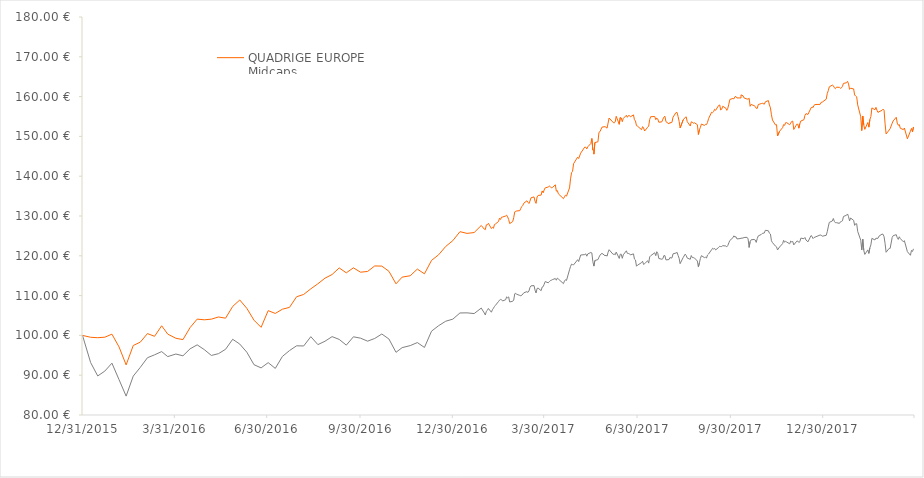
| Category |  QUADRIGE EUROPE
Midcaps    |  Stoxx Europe Ex UK Small Net Return  |
|---|---|---|
| 12/31/15 | 100 | 100 |
| 1/8/16 | 99.53 | 93.186 |
| 1/15/16 | 99.42 | 89.81 |
| 1/22/16 | 99.55 | 91.035 |
| 1/29/16 | 100.31 | 93.024 |
| 2/5/16 | 97.11 | 88.883 |
| 2/12/16 | 92.59 | 84.746 |
| 2/19/16 | 97.46 | 89.771 |
| 2/26/16 | 98.31 | 91.98 |
| 3/4/16 | 100.46 | 94.39 |
| 3/11/16 | 99.77 | 95.116 |
| 3/18/16 | 102.42 | 95.935 |
| 3/24/16 | 100.32 | 94.673 |
| 4/1/16 | 99.28 | 95.319 |
| 4/8/16 | 98.94 | 94.872 |
| 4/15/16 | 101.95 | 96.62 |
| 4/22/16 | 104.09 | 97.627 |
| 4/29/16 | 103.92 | 96.434 |
| 5/6/16 | 104.08 | 94.964 |
| 5/13/16 | 104.63 | 95.412 |
| 5/20/16 | 104.33 | 96.51 |
| 5/27/16 | 107.27 | 99.025 |
| 6/3/16 | 108.9 | 97.822 |
| 6/10/16 | 106.78 | 95.755 |
| 6/17/16 | 103.83 | 92.646 |
| 6/24/16 | 102.03 | 91.833 |
| 7/1/16 | 106.22 | 93.156 |
| 7/8/16 | 105.52 | 91.714 |
| 7/15/16 | 106.58 | 94.707 |
| 7/22/16 | 107.04 | 96.186 |
| 7/29/16 | 109.71 | 97.385 |
| 8/5/16 | 110.29 | 97.348 |
| 8/12/16 | 111.7 | 99.682 |
| 8/19/16 | 112.97 | 97.683 |
| 8/26/16 | 114.38 | 98.537 |
| 9/2/16 | 115.3 | 99.693 |
| 9/9/16 | 116.95 | 98.993 |
| 9/16/16 | 115.72 | 97.554 |
| 9/23/16 | 116.98 | 99.646 |
| 9/30/16 | 115.88 | 99.306 |
| 10/7/16 | 116.07 | 98.55 |
| 10/14/16 | 117.45 | 99.231 |
| 10/21/16 | 117.41 | 100.348 |
| 10/28/16 | 116.11 | 99.094 |
| 11/4/16 | 112.96 | 95.749 |
| 11/10/16 | 114.64 | 96.922 |
| 11/18/16 | 114.99 | 97.437 |
| 11/25/16 | 116.66 | 98.2 |
| 12/2/16 | 115.47 | 96.974 |
| 12/9/16 | 118.85 | 101.063 |
| 12/16/16 | 120.26 | 102.444 |
| 12/23/16 | 122.36 | 103.564 |
| 12/30/16 | 123.81 | 104.089 |
| 1/6/17 | 126.06 | 105.639 |
| 1/13/17 | 125.63 | 105.667 |
| 1/20/17 | 125.84 | 105.481 |
| 1/27/17 | 127.62 | 106.868 |
| 1/30/17 | 126.7 | 105.623 |
| 1/31/17 | 126.57 | 105.126 |
| 2/1/17 | 127.78 | 106.058 |
| 2/2/17 | 127.81 | 106.291 |
| 2/3/17 | 128.17 | 106.762 |
| 2/6/17 | 126.85 | 105.827 |
| 2/7/17 | 127.16 | 106.445 |
| 2/8/17 | 126.91 | 106.819 |
| 2/9/17 | 127.85 | 107.249 |
| 2/10/17 | 128 | 107.558 |
| 2/13/17 | 128.62 | 108.502 |
| 2/14/17 | 129.45 | 108.857 |
| 2/15/17 | 129.13 | 109.04 |
| 2/16/17 | 129.71 | 108.969 |
| 2/17/17 | 129.74 | 108.658 |
| 2/20/17 | 130 | 108.958 |
| 2/21/17 | 130.21 | 109.684 |
| 2/22/17 | 129.76 | 109.459 |
| 2/23/17 | 129.15 | 109.671 |
| 2/24/17 | 128.09 | 108.407 |
| 2/27/17 | 128.61 | 108.57 |
| 2/28/17 | 129.59 | 108.9 |
| 3/1/17 | 131.04 | 110.46 |
| 3/2/17 | 131.18 | 110.56 |
| 3/3/17 | 131.27 | 110.33 |
| 3/6/17 | 131.34 | 110.05 |
| 3/7/17 | 131.94 | 109.95 |
| 3/8/17 | 132.4 | 110.1 |
| 3/9/17 | 132.69 | 110.4 |
| 3/10/17 | 133.23 | 110.71 |
| 3/13/17 | 133.82 | 111 |
| 3/14/17 | 133.45 | 110.8 |
| 3/15/17 | 133.14 | 111.16 |
| 3/16/17 | 133.75 | 112.04 |
| 3/17/17 | 134.56 | 112.45 |
| 3/20/17 | 134.8 | 112.52 |
| 3/21/17 | 133.73 | 111.36 |
| 3/22/17 | 133.17 | 110.66 |
| 3/23/17 | 134.76 | 111.78 |
| 3/24/17 | 135.17 | 111.89 |
| 3/27/17 | 135.25 | 111.24 |
| 3/28/17 | 136.3 | 112.14 |
| 3/29/17 | 135.83 | 112.25 |
| 3/30/17 | 136.54 | 112.84 |
| 3/31/17 | 137.07 | 113.53 |
| 4/3/17 | 137.28 | 113.21 |
| 4/4/17 | 137.52 | 113.49 |
| 4/5/17 | 137.4 | 113.75 |
| 4/6/17 | 137.08 | 113.85 |
| 4/7/17 | 137.12 | 114 |
| 4/10/17 | 137.84 | 114.29 |
| 4/11/17 | 136.25 | 113.87 |
| 4/12/17 | 136.38 | 114.4 |
| 4/13/17 | 135.57 | 114.17 |
| 4/18/17 | 134.36 | 113.01 |
| 4/19/17 | 134.8 | 113.64 |
| 4/20/17 | 135.23 | 113.99 |
| 4/21/17 | 135 | 113.81 |
| 4/24/17 | 137.05 | 116.49 |
| 4/25/17 | 139.34 | 117.33 |
| 4/26/17 | 140.88 | 117.91 |
| 4/27/17 | 141.24 | 117.78 |
| 4/28/17 | 143.14 | 117.72 |
| 5/2/17 | 144.79 | 119.02 |
| 5/3/17 | 144.45 | 118.56 |
| 5/5/17 | 145.8 | 120.19 |
| 5/9/17 | 147.32 | 120.31 |
| 5/10/17 | 147.28 | 120.49 |
| 5/11/17 | 146.85 | 119.9 |
| 5/12/17 | 147.39 | 120.47 |
| 5/15/17 | 148.21 | 120.83 |
| 5/16/17 | 149.47 | 120.71 |
| 5/17/17 | 146.55 | 118.52 |
| 5/17/17 | 146.55 | 118.52 |
| 5/18/17 | 146.55 | 117.41 |
| 5/18/17 | 146.55 | 117.41 |
| 5/18/17 | 145.54 | 117.41 |
| 5/19/17 | 148.45 | 118.82 |
| 5/22/17 | 148.65 | 119.04 |
| 5/23/17 | 151 | 119.65 |
| 5/24/17 | 151.19 | 120.17 |
| 5/26/17 | 152.33 | 120.63 |
| 5/29/17 | 152.45 | 120.01 |
| 5/30/17 | 152.26 | 120.15 |
| 5/31/17 | 152.08 | 119.9 |
| 6/1/17 | 153.35 | 120.89 |
| 6/2/17 | 154.62 | 121.53 |
| 6/6/17 | 153.5 | 120.35 |
| 6/7/17 | 153.38 | 120.46 |
| 6/8/17 | 153.63 | 120.25 |
| 6/9/17 | 155.05 | 120.94 |
| 6/12/17 | 153.04 | 119.34 |
| 6/13/17 | 154.75 | 120.4 |
| 6/14/17 | 154.63 | 120.39 |
| 6/15/17 | 153.7 | 119.37 |
| 6/16/17 | 154.51 | 120.25 |
| 6/19/17 | 155.31 | 121.26 |
| 6/20/17 | 154.8 | 120.61 |
| 6/21/17 | 155.22 | 120.58 |
| 6/22/17 | 155.25 | 120.53 |
| 6/23/17 | 154.92 | 120.22 |
| 6/26/17 | 155.41 | 120.49 |
| 6/27/17 | 154.18 | 119.17 |
| 6/28/17 | 153.86 | 118.95 |
| 6/29/17 | 152.71 | 117.38 |
| 6/30/17 | 152.57 | 117.64 |
| 7/4/17 | 151.69 | 118.29 |
| 7/5/17 | 152.45 | 118.64 |
| 7/6/17 | 152.12 | 117.81 |
| 7/7/17 | 151.35 | 118 |
| 7/10/17 | 152.31 | 118.78 |
| 7/11/17 | 152.59 | 118.16 |
| 7/12/17 | 154.25 | 119.74 |
| 7/13/17 | 154.95 | 120.02 |
| 7/17/17 | 154.99 | 120.77 |
| 7/18/17 | 154.21 | 120.03 |
| 7/19/17 | 154.6 | 121.03 |
| 7/20/17 | 154.36 | 120.58 |
| 7/21/17 | 153.55 | 119.33 |
| 7/24/17 | 153.66 | 119.13 |
| 7/25/17 | 154.34 | 119.28 |
| 7/26/17 | 154.85 | 120.06 |
| 7/27/17 | 155.06 | 120.04 |
| 7/28/17 | 153.71 | 118.97 |
| 7/31/17 | 153.13 | 119.05 |
| 8/1/17 | 153.55 | 119.59 |
| 8/2/17 | 153.32 | 119.43 |
| 8/3/17 | 153.6 | 119.49 |
| 8/4/17 | 154.83 | 120.49 |
| 8/7/17 | 156.02 | 120.7 |
| 8/8/17 | 156.01 | 120.87 |
| 8/9/17 | 154.97 | 120.07 |
| 8/10/17 | 153.8 | 119.38 |
| 8/11/17 | 152.12 | 118.02 |
| 8/14/17 | 154.15 | 119.57 |
| 8/16/17 | 154.77 | 120.42 |
| 8/17/17 | 154.91 | 120.07 |
| 8/18/17 | 153.71 | 119.43 |
| 8/21/17 | 152.61 | 119.12 |
| 8/22/17 | 153.66 | 120.06 |
| 8/23/17 | 153.58 | 119.56 |
| 8/24/17 | 153.3 | 119.54 |
| 8/25/17 | 153.43 | 119.49 |
| 8/28/17 | 152.95 | 118.68 |
| 8/29/17 | 150.48 | 117.18 |
| 8/30/17 | 151.64 | 118.24 |
| 8/31/17 | 152.3 | 119.34 |
| 9/1/17 | 153.1 | 120.03 |
| 9/4/17 | 152.74 | 119.54 |
| 9/5/17 | 153.04 | 119.63 |
| 9/6/17 | 152.97 | 119.44 |
| 9/7/17 | 153.51 | 120.19 |
| 9/8/17 | 154.45 | 120.44 |
| 9/11/17 | 156.07 | 121.51 |
| 9/12/17 | 155.96 | 121.89 |
| 9/13/17 | 156.21 | 121.71 |
| 9/14/17 | 156.81 | 121.85 |
| 9/15/17 | 156.56 | 121.48 |
| 9/18/17 | 157.79 | 122.11 |
| 9/19/17 | 157.9 | 122.39 |
| 9/20/17 | 156.63 | 122.32 |
| 9/21/17 | 156.84 | 122.34 |
| 9/22/17 | 157.57 | 122.55 |
| 9/25/17 | 157.1 | 122.47 |
| 9/26/17 | 156.55 | 122.26 |
| 9/27/17 | 157.08 | 122.6 |
| 9/28/17 | 158.11 | 123.25 |
| 9/29/17 | 159.27 | 123.85 |
| 10/2/17 | 159.55 | 124.53 |
| 10/3/17 | 159.42 | 125.02 |
| 10/4/17 | 159.95 | 124.7 |
| 10/5/17 | 160.04 | 124.81 |
| 10/6/17 | 159.66 | 124.24 |
| 10/9/17 | 159.67 | 124.33 |
| 10/10/17 | 159.65 | 124.41 |
| 10/10/17 | 160.44 | 124.5 |
| 10/12/17 | 160.2 | 124.47 |
| 10/13/17 | 159.67 | 124.6 |
| 10/16/17 | 159.38 | 124.64 |
| 10/17/17 | 159.36 | 124.24 |
| 10/18/17 | 159.6 | 122.11 |
| 10/19/17 | 157.56 | 123.58 |
| 10/20/17 | 158.03 | 124.03 |
| 10/23/17 | 157.71 | 124.1 |
| 10/24/17 | 157.53 | 123.98 |
| 10/25/17 | 157.06 | 123.37 |
| 10/26/17 | 157.04 | 124.33 |
| 10/27/17 | 158 | 125 |
| 10/30/17 | 158.25 | 125.36 |
| 10/31/17 | 158.34 | 125.62 |
| 11/2/17 | 158.1 | 125.74 |
| 11/3/17 | 158.69 | 126.41 |
| 11/6/17 | 159 | 126.29 |
| 11/7/17 | 157.89 | 125.67 |
| 11/8/17 | 157.18 | 125.47 |
| 11/9/17 | 155.44 | 123.79 |
| 11/10/17 | 154.12 | 123.32 |
| 11/13/17 | 152.87 | 122.42 |
| 11/14/17 | 152.96 | 122.25 |
| 11/15/17 | 150.11 | 121.47 |
| 11/17/17 | 151.28 | 122.21 |
| 11/20/17 | 152.2 | 123.05 |
| 11/21/17 | 152.96 | 123.89 |
| 11/22/17 | 152.78 | 123.41 |
| 11/23/17 | 153.46 | 123.64 |
| 11/24/17 | 153.45 | 123.47 |
| 11/27/17 | 152.92 | 123.01 |
| 11/28/17 | 153.34 | 123.71 |
| 11/29/17 | 153.77 | 123.49 |
| 11/30/17 | 153.83 | 123.6 |
| 12/1/17 | 151.74 | 122.74 |
| 12/4/17 | 153.07 | 123.68 |
| 12/5/17 | 153.06 | 123.7 |
| 12/6/17 | 152.07 | 123.34 |
| 12/7/17 | 153.22 | 123.55 |
| 12/8/17 | 153.87 | 124.44 |
| 12/11/17 | 154.18 | 124.3 |
| 12/12/17 | 155.28 | 124.6 |
| 12/13/17 | 155.73 | 123.97 |
| 12/15/17 | 155.52 | 123.51 |
| 12/18/17 | 157.15 | 125.08 |
| 12/19/17 | 157.42 | 124.89 |
| 12/20/17 | 157.24 | 124.33 |
| 12/21/17 | 157.82 | 124.59 |
| 12/22/17 | 158.01 | 124.7 |
| 12/27/17 | 158.05 | 125.23 |
| 12/28/17 | 158.56 | 125.17 |
| 12/29/17 | 158.6 | 124.92 |
| 1/2/18 | 159.35 | 125.14 |
| 1/3/18 | 160.75 | 126.06 |
| 1/4/18 | 161.48 | 127.25 |
| 1/5/18 | 162.45 | 128.39 |
| 1/5/18 | 162.45 | 128.39 |
| 1/8/18 | 162.89 | 128.75 |
| 1/9/18 | 162.74 | 129.37 |
| 1/10/18 | 162.23 | 128.64 |
| 1/11/18 | 161.99 | 128.32 |
| 1/12/18 | 162.36 | 128.33 |
| 1/15/18 | 162.33 | 128.15 |
| 1/16/18 | 162.08 | 128.54 |
| 1/17/18 | 162.2 | 128.64 |
| 1/18/18 | 162.6 | 128.79 |
| 1/19/18 | 163.33 | 129.88 |
| 1/22/18 | 163.47 | 130.19 |
| 1/23/18 | 163.83 | 130.51 |
| 1/24/18 | 163.19 | 129.82 |
| 1/25/18 | 161.82 | 128.76 |
| 1/26/18 | 162.11 | 129.49 |
| 1/29/18 | 161.93 | 128.91 |
| 1/30/18 | 160.41 | 127.65 |
| 1/31/18 | 160.13 | 128.06 |
| 2/1/18 | 159.95 | 128.05 |
| 2/2/18 | 157.92 | 126.13 |
| 2/5/18 | 154.94 | 123.92 |
| 2/6/18 | 151.47 | 121.47 |
| 2/7/18 | 155.13 | 124.17 |
| 2/8/18 | 152.87 | 121.38 |
| 2/9/18 | 151.77 | 120.35 |
| 2/12/18 | 153.49 | 121.49 |
| 2/13/18 | 152.32 | 120.6 |
| 2/14/18 | 154.25 | 121.99 |
| 2/15/18 | 154.98 | 122.76 |
| 2/16/18 | 157.16 | 124.38 |
| 2/19/18 | 156.69 | 123.98 |
| 2/20/18 | 157.3 | 124.44 |
| 2/21/18 | 156.58 | 124.37 |
| 2/22/18 | 156.01 | 124.4 |
| 2/23/18 | 156.2 | 124.94 |
| 2/26/18 | 156.54 | 125.45 |
| 2/27/18 | 156.85 | 125.41 |
| 2/28/18 | 156.59 | 124.8 |
| 3/1/18 | 153.18 | 123.08 |
| 3/2/18 | 150.61 | 120.89 |
| 3/5/18 | 151.59 | 121.86 |
| 3/5/18 | 151.59 | 121.86 |
| 3/6/18 | 151.94 | 121.86 |
| 3/8/18 | 153.31 | 124.6 |
| 3/9/18 | 153.89 | 125.06 |
| 3/12/18 | 154.81 | 125.31 |
| 3/13/18 | 153.34 | 124.56 |
| 3/14/18 | 152.8 | 124.12 |
| 3/15/18 | 152.98 | 124.78 |
| 3/16/18 | 152.04 | 124.33 |
| 3/19/18 | 151.71 | 123.52 |
| 3/20/18 | 152.11 | 123.8 |
| 3/23/18 | 149.39 | 121.04 |
| 3/26/18 | 151.33 | 120.13 |
| 3/27/18 | 152 | 121.36 |
| 3/28/18 | 151.14 | 121.09 |
| 3/29/18 | 152.37 | 121.75 |